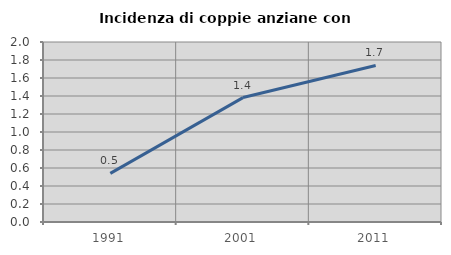
| Category | Incidenza di coppie anziane con figli |
|---|---|
| 1991.0 | 0.541 |
| 2001.0 | 1.382 |
| 2011.0 | 1.739 |